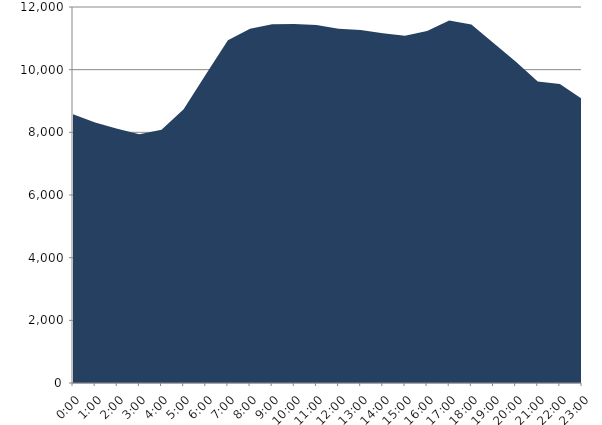
| Category | Series 0 | Series 1 |
|---|---|---|
| 2017-01-18 |  | 8578.51 |
| 2017-01-18 01:00:00 |  | 8316.88 |
| 2017-01-18 02:00:00 |  | 8113.07 |
| 2017-01-18 03:00:00 |  | 7939.44 |
| 2017-01-18 04:00:00 |  | 8083.71 |
| 2017-01-18 05:00:00 |  | 8737.61 |
| 2017-01-18 06:00:00 |  | 9848.22 |
| 2017-01-18 07:00:00 |  | 10941.73 |
| 2017-01-18 08:00:00 |  | 11308.18 |
| 2017-01-18 09:00:00 |  | 11447.92 |
| 2017-01-18 10:00:00 |  | 11460.42 |
| 2017-01-18 11:00:00 |  | 11422.87 |
| 2017-01-18 12:00:00 |  | 11304.68 |
| 2017-01-18 13:00:00 |  | 11263.59 |
| 2017-01-18 14:00:00 |  | 11166.06 |
| 2017-01-18 15:00:00 |  | 11084.73 |
| 2017-01-18 16:00:00 |  | 11235.08 |
| 2017-01-18 17:00:00 |  | 11566.26 |
| 2017-01-18 18:00:00 |  | 11443.3 |
| 2017-01-18 19:00:00 |  | 10853.72 |
| 2017-01-18 20:00:00 |  | 10260.08 |
| 2017-01-18 21:00:00 |  | 9626.2 |
| 2017-01-18 22:00:00 |  | 9544.42 |
| 2017-01-18 23:00:00 |  | 9068.51 |